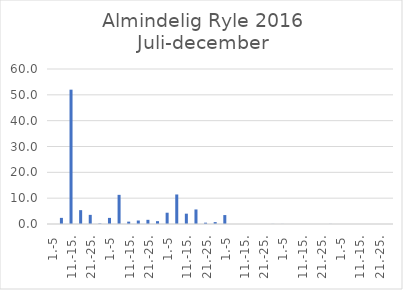
| Category | Series 0 |
|---|---|
| 1.-5 | 0 |
| 6.-10. | 2.37 |
| 11.-15. | 52 |
| 16.-20. | 5.362 |
| 21.-25. | 3.536 |
| 26.-31. | 0.188 |
| 1.-5 | 2.363 |
| 6.-10. | 11.287 |
| 11.-15. | 0.911 |
| 16.-20. | 1.35 |
| 21.-25. | 1.618 |
| 26.-31. | 1.104 |
| 1.-5 | 4.368 |
| 6.-10. | 11.429 |
| 11.-15. | 4 |
| 16.-20. | 5.63 |
| 21.-25. | 0.512 |
| 26.-30. | 0.731 |
| 1.-5 | 3.457 |
| 6.-10. | 0 |
| 11.-15. | 0 |
| 16.-20. | 0 |
| 21.-25. | 0 |
| 26.-31. | 0.036 |
| 1.-5 | 0.023 |
| 6.-10. | 0 |
| 11.-15. | 0 |
| 16.-20. | 0 |
| 21.-25. | 0 |
| 26.-30. | 0.033 |
| 1.-5 | 0 |
| 6.-10. | 0 |
| 11.-15. | 0 |
| 16.-20. | 0 |
| 21.-25. | 0 |
| 26.-31. | 0 |